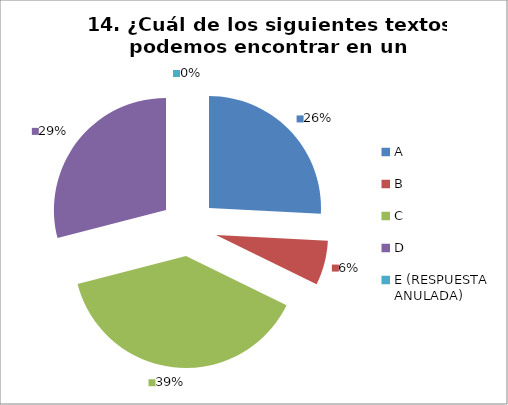
| Category | CANTIDAD DE RESPUESTAS PREGUNTA (14) | PORCENTAJE |
|---|---|---|
| A | 8 | 0.258 |
| B | 2 | 0.065 |
| C | 12 | 0.387 |
| D | 9 | 0.29 |
| E (RESPUESTA ANULADA) | 0 | 0 |